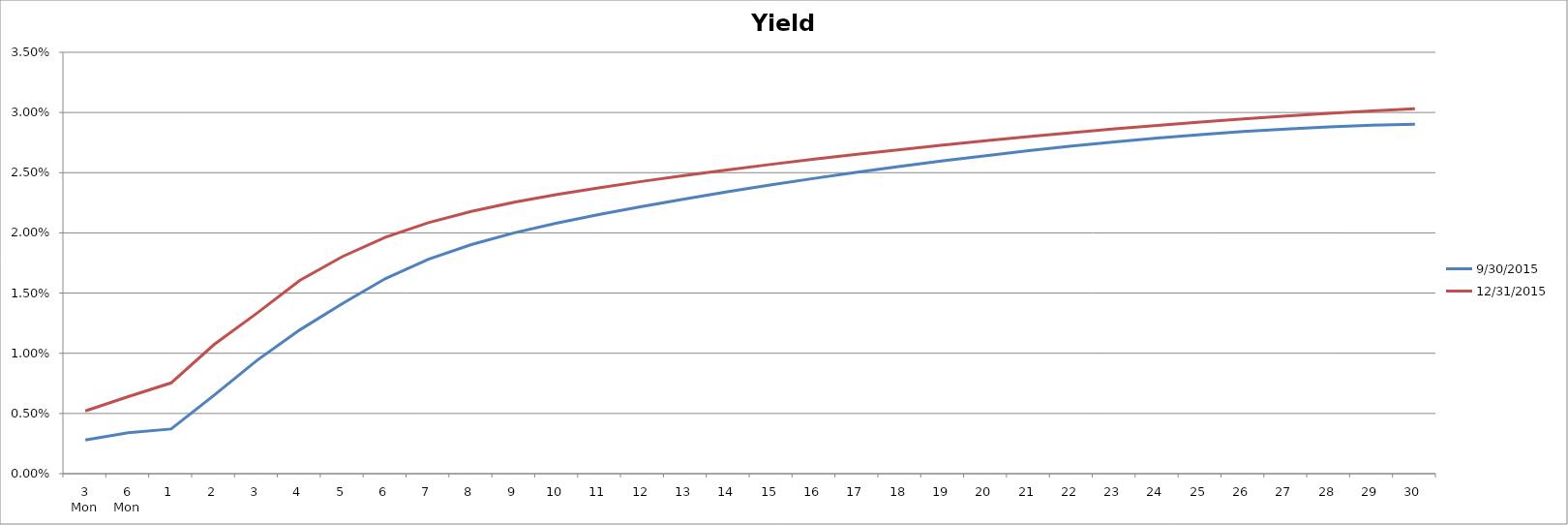
| Category | 9/30/2015 | 12/31/2015 |
|---|---|---|
| 3 Mon | 0.003 | 0.005 |
| 6 Mon | 0.003 | 0.006 |
| 1 | 0.004 | 0.008 |
| 2 | 0.007 | 0.011 |
| 3 | 0.009 | 0.013 |
| 4 | 0.012 | 0.016 |
| 5 | 0.014 | 0.018 |
| 6 | 0.016 | 0.02 |
| 7 | 0.018 | 0.021 |
| 8 | 0.019 | 0.022 |
| 9 | 0.02 | 0.023 |
| 10 | 0.021 | 0.023 |
| 11 | 0.022 | 0.024 |
| 12 | 0.022 | 0.024 |
| 13 | 0.023 | 0.025 |
| 14 | 0.023 | 0.025 |
| 15 | 0.024 | 0.026 |
| 16 | 0.025 | 0.026 |
| 17 | 0.025 | 0.027 |
| 18 | 0.026 | 0.027 |
| 19 | 0.026 | 0.027 |
| 20 | 0.026 | 0.028 |
| 21 | 0.027 | 0.028 |
| 22 | 0.027 | 0.028 |
| 23 | 0.028 | 0.029 |
| 24 | 0.028 | 0.029 |
| 25 | 0.028 | 0.029 |
| 26 | 0.028 | 0.029 |
| 27 | 0.029 | 0.03 |
| 28 | 0.029 | 0.03 |
| 29 | 0.029 | 0.03 |
| 30 | 0.029 | 0.03 |